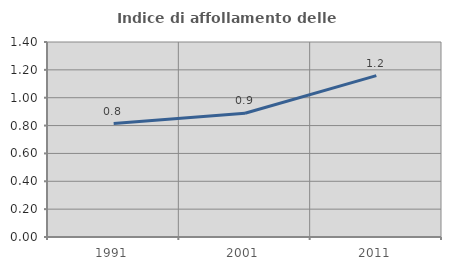
| Category | Indice di affollamento delle abitazioni  |
|---|---|
| 1991.0 | 0.815 |
| 2001.0 | 0.888 |
| 2011.0 | 1.159 |